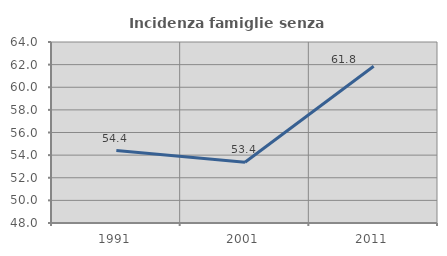
| Category | Incidenza famiglie senza nuclei |
|---|---|
| 1991.0 | 54.404 |
| 2001.0 | 53.371 |
| 2011.0 | 61.85 |